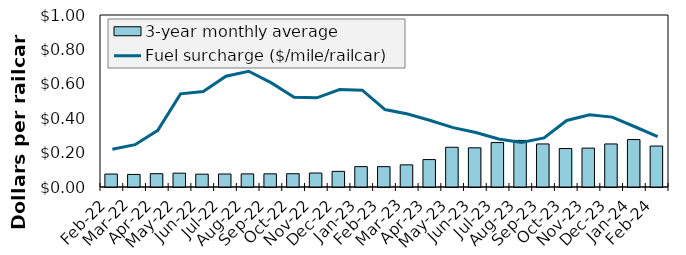
| Category | 3-year monthly average  |
|---|---|
| Feb-22 | 0.075 |
| Mar-22 | 0.073 |
| Apr-22 | 0.077 |
| May-22 | 0.08 |
| Jun-22 | 0.075 |
| Jul-22 | 0.076 |
| Aug-22 | 0.076 |
| Sep-22 | 0.077 |
| Oct-22 | 0.077 |
| Nov-22 | 0.081 |
| Dec-22 | 0.091 |
| Jan-23 | 0.119 |
| Feb-23 | 0.118 |
| Mar-23 | 0.129 |
| Apr-23 | 0.159 |
| May-23 | 0.231 |
| Jun-23 | 0.228 |
| Jul-23 | 0.258 |
| Aug-23 | 0.271 |
| Sep-23 | 0.25 |
| Oct-23 | 0.224 |
| Nov-23 | 0.226 |
| Dec-23 | 0.25 |
| Jan-24 | 0.276 |
| Feb-24 | 0.238 |